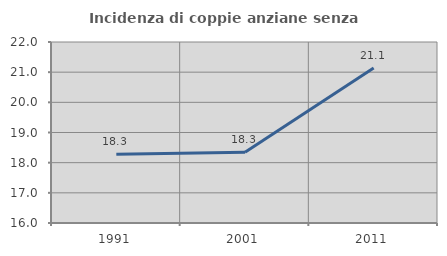
| Category | Incidenza di coppie anziane senza figli  |
|---|---|
| 1991.0 | 18.28 |
| 2001.0 | 18.349 |
| 2011.0 | 21.138 |